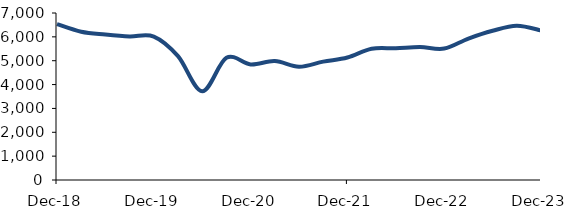
| Category | Series 0 |
|---|---|
| 2018-12-01 | 6534.66 |
| 2019-03-01 | 6213.721 |
| 2019-06-01 | 6096.882 |
| 2019-09-01 | 6017.225 |
| 2019-12-01 | 6012.043 |
| 2020-03-01 | 5191.607 |
| 2020-06-01 | 3718.487 |
| 2020-09-01 | 5121.583 |
| 2020-12-01 | 4846.365 |
| 2021-03-01 | 4985.619 |
| 2021-06-01 | 4744.557 |
| 2021-09-01 | 4960.614 |
| 2021-12-01 | 5134.278 |
| 2022-03-01 | 5499.511 |
| 2022-06-01 | 5520.278 |
| 2022-09-01 | 5570.662 |
| 2022-12-01 | 5509.081 |
| 2023-03-01 | 5929.042 |
| 2023-06-01 | 6255.496 |
| 2023-09-01 | 6464.493 |
| 2023-12-01 | 6269.715 |